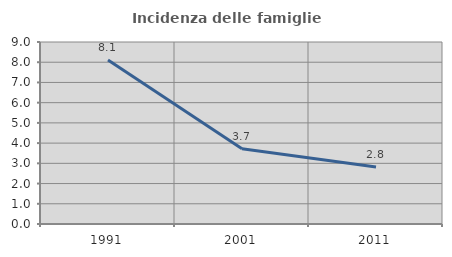
| Category | Incidenza delle famiglie numerose |
|---|---|
| 1991.0 | 8.107 |
| 2001.0 | 3.723 |
| 2011.0 | 2.823 |